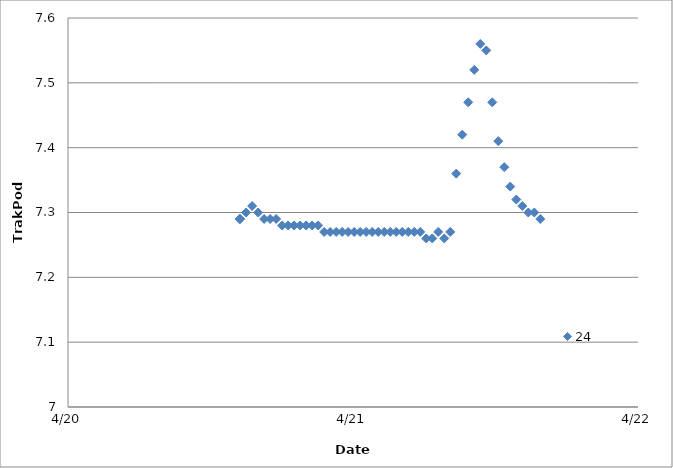
| Category | 24 |
|---|---|
| 42480.6021412037 | 7.29 |
| 42480.60300925926 | 7.29 |
| 42480.60380787037 | 7.29 |
| 42480.62501157408 | 7.3 |
| 42480.64607638889 | 7.31 |
| 42480.6671412037 | 7.3 |
| 42480.688206018516 | 7.29 |
| 42480.70927083334 | 7.29 |
| 42480.73033564815 | 7.29 |
| 42480.751493055555 | 7.28 |
| 42480.772465277776 | 7.28 |
| 42480.79353009259 | 7.28 |
| 42480.81459490741 | 7.28 |
| 42480.83565972222 | 7.28 |
| 42480.856724537036 | 7.28 |
| 42480.87788194444 | 7.28 |
| 42480.89885416667 | 7.27 |
| 42480.91991898148 | 7.27 |
| 42480.94107638889 | 7.27 |
| 42480.96210648148 | 7.27 |
| 42480.98311342593 | 7.27 |
| 42481.00417824074 | 7.27 |
| 42481.025243055556 | 7.27 |
| 42481.04630787037 | 7.27 |
| 42481.06737268518 | 7.27 |
| 42481.0884375 | 7.27 |
| 42481.109502314815 | 7.27 |
| 42481.13065972222 | 7.27 |
| 42481.15163194444 | 7.27 |
| 42481.17269675926 | 7.27 |
| 42481.19385416667 | 7.27 |
| 42481.21482638889 | 7.27 |
| 42481.2358912037 | 7.27 |
| 42481.25695601852 | 7.26 |
| 42481.278020833335 | 7.26 |
| 42481.29908564815 | 7.27 |
| 42481.32015046296 | 7.26 |
| 42481.341215277775 | 7.27 |
| 42481.362280092595 | 7.36 |
| 42481.38334490741 | 7.42 |
| 42481.40440972222 | 7.47 |
| 42481.425474537034 | 7.52 |
| 42481.44663194445 | 7.56 |
| 42481.46760416667 | 7.55 |
| 42481.48866898148 | 7.47 |
| 42481.509733796294 | 7.41 |
| 42481.530798611115 | 7.37 |
| 42481.55186342593 | 7.34 |
| 42481.57292824074 | 7.32 |
| 42481.593993055554 | 7.31 |
| 42481.61505787037 | 7.3 |
| 42481.63612268519 | 7.3 |
| 42481.6571875 | 7.29 |